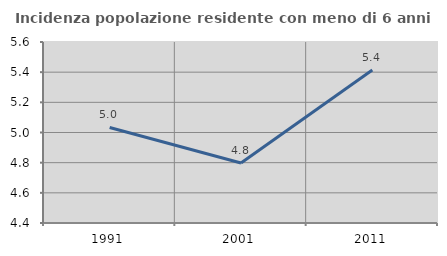
| Category | Incidenza popolazione residente con meno di 6 anni |
|---|---|
| 1991.0 | 5.033 |
| 2001.0 | 4.797 |
| 2011.0 | 5.414 |